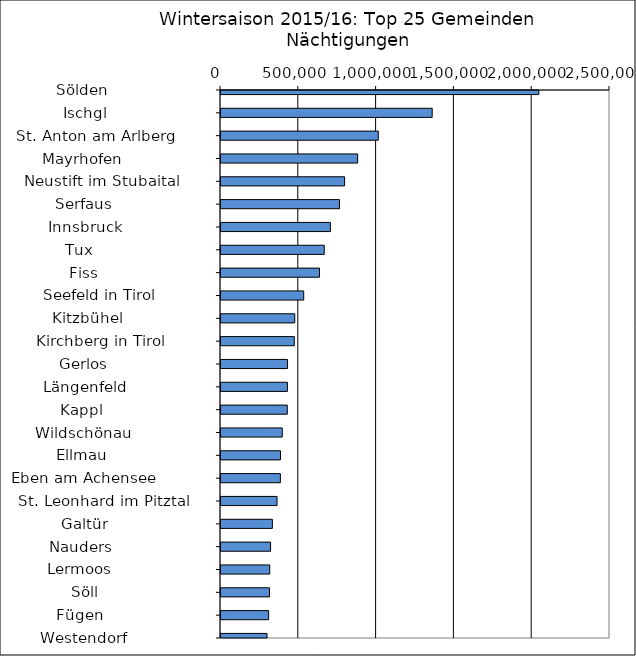
| Category | Series 0 |
|---|---|
|   Sölden                     | 2042641 |
|   Ischgl                     | 1357298 |
|   St. Anton am Arlberg       | 1010797 |
|   Mayrhofen                  | 878219 |
|   Neustift im Stubaital      | 794228 |
|   Serfaus                    | 761447 |
|   Innsbruck                  | 703027 |
|   Tux                        | 663479 |
|   Fiss                       | 632848 |
|   Seefeld in Tirol           | 531524 |
|   Kitzbühel                  | 473942 |
|   Kirchberg in Tirol         | 471069 |
|   Gerlos                     | 427729 |
|   Längenfeld                 | 426802 |
|   Kappl                      | 425968 |
|   Wildschönau                | 393680 |
|   Ellmau                     | 382565 |
|   Eben am Achensee           | 381510 |
|   St. Leonhard im Pitztal    | 360162 |
|   Galtür                     | 330207 |
|   Nauders                    | 318526 |
|   Lermoos                    | 313034 |
|   Söll                       | 311875 |
|   Fügen                      | 306034 |
|   Westendorf                 | 295939 |